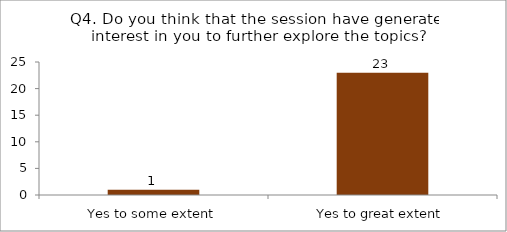
| Category | Q4. Do you think that the session have generated interest in you to further explore the topics? |
|---|---|
| Yes to some extent | 1 |
| Yes to great extent | 23 |